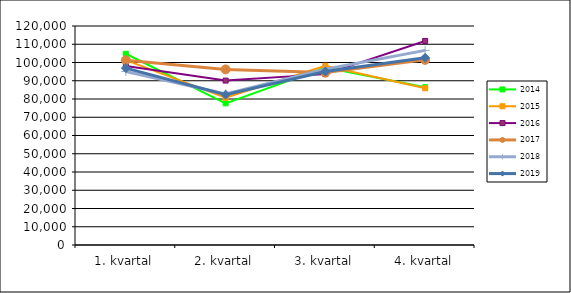
| Category | 2014 | 2015 | 2016 | 2017 | 2018 | 2019 |
|---|---|---|---|---|---|---|
| 1. kvartal | 104791 | 101298 | 98056 | 101262 | 95094 | 96916 |
| 2. kvartal | 77614 | 80664 | 90093 | 96227 | 82744 | 82376 |
| 3. kvartal | 97292 | 98207 | 93628 | 94518 | 96350 | 95064 |
| 4. kvartal | 86448 | 85892 | 111805 | 101438 | 106644 | 102553 |